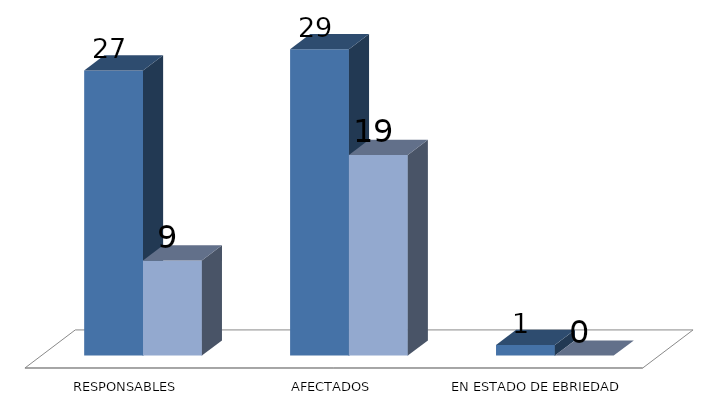
| Category | Series 0 | Series 1 |
|---|---|---|
| RESPONSABLES | 27 | 9 |
| AFECTADOS | 29 | 19 |
| EN ESTADO DE EBRIEDAD | 1 | 0 |